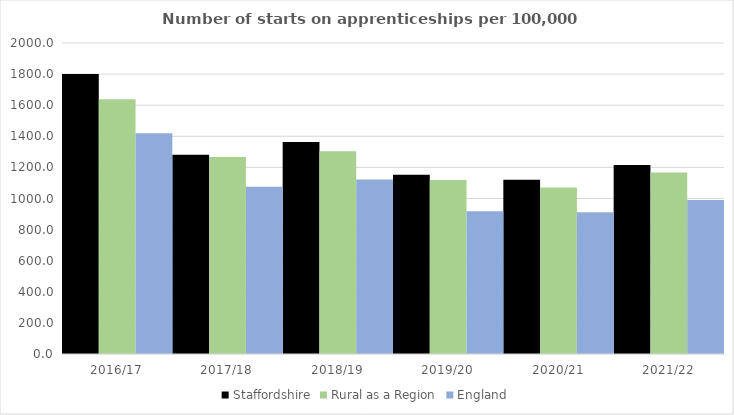
| Category | Staffordshire | Rural as a Region | England |
|---|---|---|---|
| 2016/17 | 1800.149 | 1638.789 | 1420 |
| 2017/18 | 1280.599 | 1267.474 | 1075 |
| 2018/19 | 1363.82 | 1304.57 | 1122 |
| 2019/20 | 1153.454 | 1119.662 | 918 |
| 2020/21 | 1119.856 | 1070.748 | 912 |
| 2021/22 | 1215.802 | 1167.68 | 991 |